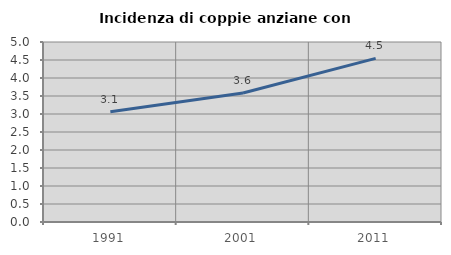
| Category | Incidenza di coppie anziane con figli |
|---|---|
| 1991.0 | 3.061 |
| 2001.0 | 3.584 |
| 2011.0 | 4.545 |